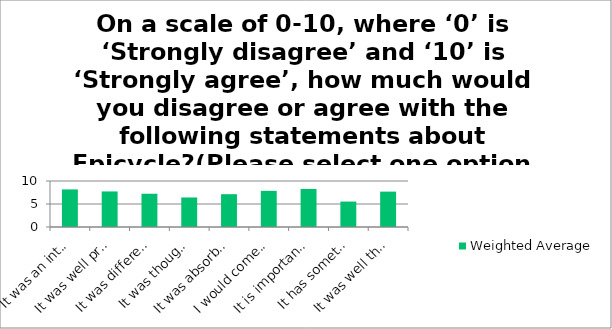
| Category | Weighted Average |
|---|---|
| It was an interesting idea | 8.17 |
| It was well produced and presented | 7.73 |
| It was different from things I’ve experienced before | 7.23 |
| It was thought-provoking | 6.42 |
| It was absorbing and held my attention | 7.13 |
| I would come to something like this again | 7.86 |
| It is important that it's happening here (in Hull) | 8.27 |
| It has something to say about the world in which we live | 5.53 |
| It was well thought through and put together | 7.69 |